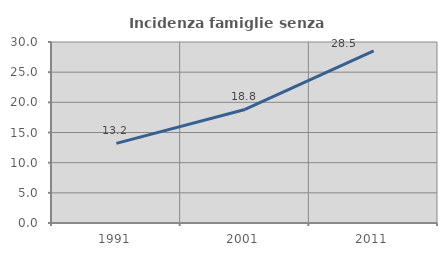
| Category | Incidenza famiglie senza nuclei |
|---|---|
| 1991.0 | 13.194 |
| 2001.0 | 18.823 |
| 2011.0 | 28.54 |